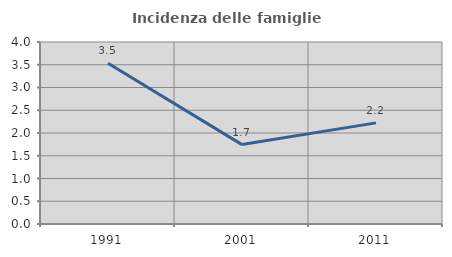
| Category | Incidenza delle famiglie numerose |
|---|---|
| 1991.0 | 3.534 |
| 2001.0 | 1.745 |
| 2011.0 | 2.222 |